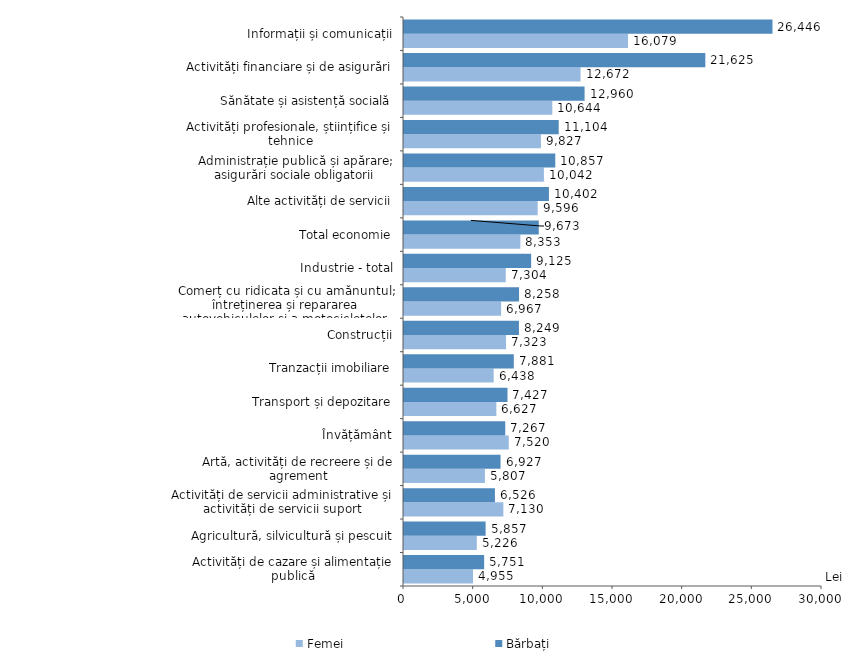
| Category | Femei | Bărbați |
|---|---|---|
| Activități de cazare și alimentație publică | 4955 | 5751.3 |
| Agricultură, silvicultură și pescuit | 5226.2 | 5856.9 |
| Activități de servicii administrative și activități de servicii suport | 7129.7 | 6525.8 |
| Artă, activități de recreere și de agrement | 5807.1 | 6927.3 |
| Învățământ | 7520.3 | 7266.7 |
| Transport și depozitare | 6627.4 | 7427.3 |
| Tranzacții imobiliare | 6438.1 | 7880.5 |
| Construcții | 7322.9 | 8248.6 |
| Comerț cu ridicata și cu amănuntul; întreținerea și repararea autovehiculelor și a motocicletelor | 6967.4 | 8257.6 |
| Industrie - total | 7304.1 | 9124.8 |
| Total economie | 8353.1 | 9672.6 |
| Alte activități de servicii | 9595.8 | 10402 |
| Administrație publică și apărare; asigurări sociale obligatorii | 10042.2 | 10856.7 |
| Activități profesionale, științifice și tehnice | 9827 | 11103.5 |
| Sănătate și asistență socială | 10643.9 | 12960.3 |
| Activități financiare și de asigurări | 12672 | 21625.3 |
| Informații și comunicații | 16079.1 | 26445.8 |